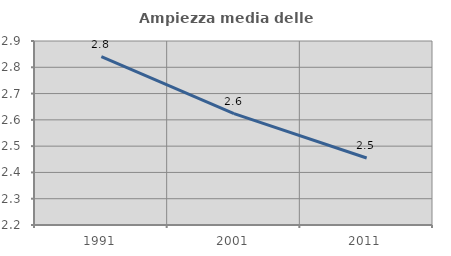
| Category | Ampiezza media delle famiglie |
|---|---|
| 1991.0 | 2.841 |
| 2001.0 | 2.624 |
| 2011.0 | 2.455 |